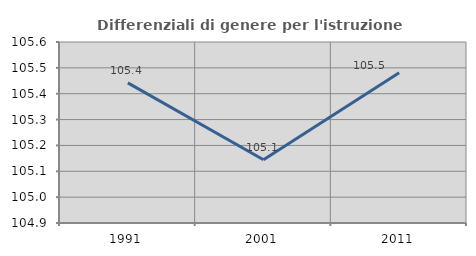
| Category | Differenziali di genere per l'istruzione superiore |
|---|---|
| 1991.0 | 105.442 |
| 2001.0 | 105.144 |
| 2011.0 | 105.481 |